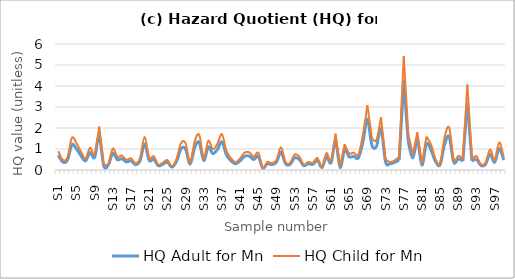
| Category | HQ Adult for Mn | HQ Child for Mn |
|---|---|---|
| S1 | 0.706 | 0.898 |
| S2 | 0.379 | 0.482 |
| S3 | 0.464 | 0.59 |
| S4 | 1.202 | 1.53 |
| S5 | 1.006 | 1.28 |
| S6 | 0.679 | 0.864 |
| S7 | 0.434 | 0.552 |
| S8 | 0.836 | 1.064 |
| S9 | 0.597 | 0.76 |
| S10 | 1.63 | 2.074 |
| S11 | 0.203 | 0.258 |
| S12 | 0.233 | 0.296 |
| S13 | 0.801 | 1.02 |
| S14 | 0.493 | 0.628 |
| S15 | 0.539 | 0.686 |
| S16 | 0.385 | 0.49 |
| S17 | 0.435 | 0.554 |
| S18 | 0.253 | 0.322 |
| S19 | 0.449 | 0.572 |
| S20 | 1.24 | 1.578 |
| S21 | 0.46 | 0.586 |
| S22 | 0.515 | 0.656 |
| S23 | 0.203 | 0.258 |
| S24 | 0.275 | 0.35 |
| S25 | 0.374 | 0.476 |
| S26 | 0.137 | 0.174 |
| S27 | 0.407 | 0.518 |
| S28 | 1.004 | 1.278 |
| S29 | 1.003 | 1.276 |
| S30 | 0.278 | 0.354 |
| S31 | 1.065 | 1.356 |
| S32 | 1.32 | 1.68 |
| S33 | 0.456 | 0.58 |
| S34 | 1.092 | 1.39 |
| S35 | 0.779 | 0.992 |
| S36 | 0.977 | 1.244 |
| S37 | 1.34 | 1.706 |
| S38 | 0.717 | 0.912 |
| S39 | 0.44 | 0.56 |
| S40 | 0.295 | 0.376 |
| S41 | 0.434 | 0.552 |
| S42 | 0.649 | 0.826 |
| S43 | 0.66 | 0.84 |
| S44 | 0.5 | 0.636 |
| S45 | 0.647 | 0.824 |
| S46 | 0.085 | 0.108 |
| S47 | 0.302 | 0.384 |
| S48 | 0.255 | 0.324 |
| S49 | 0.376 | 0.478 |
| S50 | 0.853 | 1.086 |
| S51 | 0.297 | 0.378 |
| S52 | 0.267 | 0.34 |
| S53 | 0.58 | 0.738 |
| S54 | 0.508 | 0.646 |
| S55 | 0.206 | 0.262 |
| S56 | 0.299 | 0.38 |
| S57 | 0.27 | 0.344 |
| S58 | 0.451 | 0.574 |
| S59 | 0.116 | 0.148 |
| S60 | 0.633 | 0.806 |
| S61 | 0.343 | 0.436 |
| S62 | 1.359 | 1.73 |
| S63 | 0.124 | 0.158 |
| S64 | 0.962 | 1.224 |
| S65 | 0.624 | 0.794 |
| S66 | 0.651 | 0.828 |
| S67 | 0.57 | 0.726 |
| S68 | 1.306 | 1.662 |
| S69 | 2.425 | 3.086 |
| S70 | 1.185 | 1.508 |
| S71 | 1.125 | 1.432 |
| S72 | 1.975 | 2.514 |
| S73 | 0.388 | 0.494 |
| S74 | 0.299 | 0.38 |
| S75 | 0.36 | 0.458 |
| S76 | 0.482 | 0.614 |
| S77 | 4.268 | 5.432 |
| S78 | 1.34 | 1.706 |
| S79 | 0.572 | 0.728 |
| S80 | 1.413 | 1.798 |
| S81 | 0.234 | 0.298 |
| S82 | 1.249 | 1.59 |
| S83 | 0.957 | 1.218 |
| S84 | 0.404 | 0.514 |
| S85 | 0.251 | 0.32 |
| S86 | 1.23 | 1.566 |
| S87 | 1.586 | 2.018 |
| S88 | 0.376 | 0.478 |
| S89 | 0.531 | 0.676 |
| S90 | 0.424 | 0.54 |
| S91 | 3.201 | 4.074 |
| S92 | 0.429 | 0.546 |
| S93 | 0.542 | 0.69 |
| S94 | 0.217 | 0.276 |
| S95 | 0.275 | 0.35 |
| S96 | 0.765 | 0.974 |
| S97 | 0.371 | 0.472 |
| S98 | 1.034 | 1.316 |
| S99 | 0.478 | 0.608 |